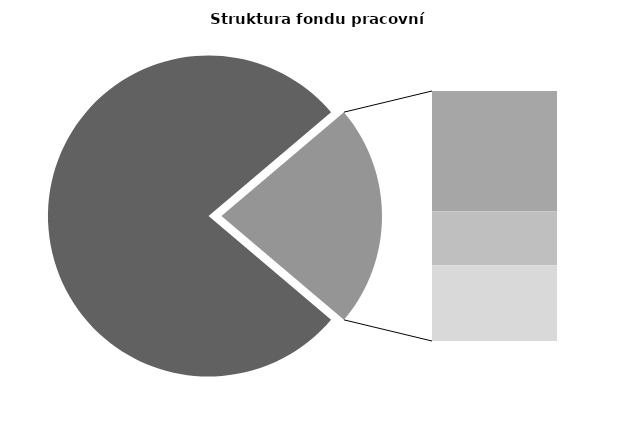
| Category | Series 0 |
|---|---|
| Průměrná měsíční odpracovaná doba bez přesčasu | 133.983 |
| Dovolená | 18.59 |
| Nemoc | 8.329 |
| Jiné | 11.715 |